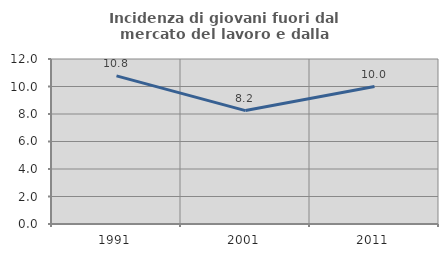
| Category | Incidenza di giovani fuori dal mercato del lavoro e dalla formazione  |
|---|---|
| 1991.0 | 10.769 |
| 2001.0 | 8.247 |
| 2011.0 | 10 |